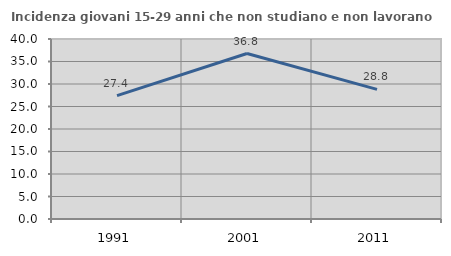
| Category | Incidenza giovani 15-29 anni che non studiano e non lavorano  |
|---|---|
| 1991.0 | 27.411 |
| 2001.0 | 36.77 |
| 2011.0 | 28.814 |